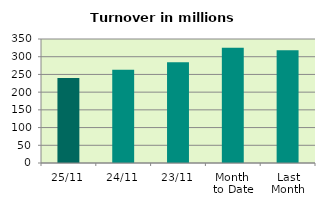
| Category | Series 0 |
|---|---|
| 25/11 | 239.941 |
| 24/11 | 263.132 |
| 23/11 | 284.377 |
| Month 
to Date | 325.458 |
| Last
Month | 318.176 |